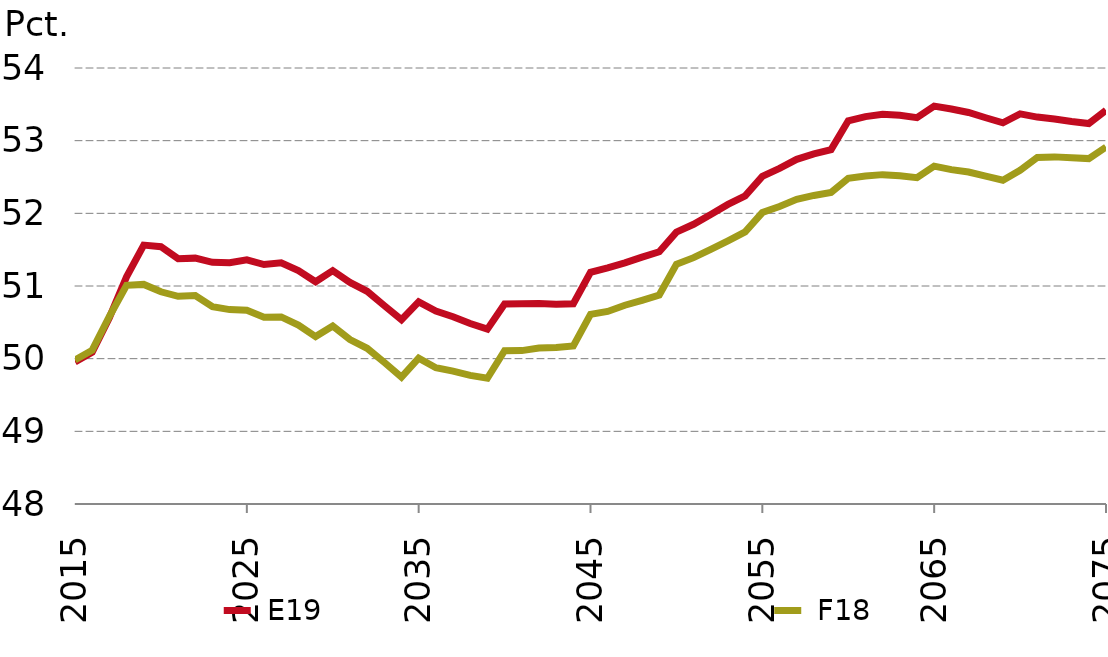
| Category | nullinje |  E19 |  F18 |
|---|---|---|---|
| 2015-01-01 | 0 | 49.954 | 49.982 |
| 2016-01-01 | 0 | 50.089 | 50.117 |
| 2017-01-01 | 0 | 50.564 | 50.581 |
| 2018-01-01 | 0 | 51.125 | 51.009 |
| 2019-01-01 | 0 | 51.563 | 51.022 |
| 2020-01-01 | 0 | 51.542 | 50.92 |
| 2021-01-01 | 0 | 51.376 | 50.858 |
| 2022-01-01 | 0 | 51.383 | 50.87 |
| 2023-01-01 | 0 | 51.325 | 50.716 |
| 2024-01-01 | 0 | 51.32 | 50.675 |
| 2025-01-01 | 0 | 51.361 | 50.666 |
| 2026-01-01 | 0 | 51.295 | 50.571 |
| 2027-01-01 | 0 | 51.319 | 50.575 |
| 2028-01-01 | 0 | 51.212 | 50.461 |
| 2029-01-01 | 0 | 51.058 | 50.304 |
| 2030-01-01 | 0 | 51.211 | 50.451 |
| 2031-01-01 | 0 | 51.05 | 50.264 |
| 2032-01-01 | 0 | 50.927 | 50.143 |
| 2033-01-01 | 0 | 50.73 | 49.949 |
| 2034-01-01 | 0 | 50.536 | 49.747 |
| 2035-01-01 | 0 | 50.782 | 50.006 |
| 2036-01-01 | 0 | 50.656 | 49.875 |
| 2037-01-01 | 0 | 50.578 | 49.83 |
| 2038-01-01 | 0 | 50.484 | 49.771 |
| 2039-01-01 | 0 | 50.406 | 49.73 |
| 2040-01-01 | 0 | 50.752 | 50.109 |
| 2041-01-01 | 0 | 50.756 | 50.111 |
| 2042-01-01 | 0 | 50.76 | 50.147 |
| 2043-01-01 | 0 | 50.749 | 50.153 |
| 2044-01-01 | 0 | 50.756 | 50.174 |
| 2045-01-01 | 0 | 51.189 | 50.61 |
| 2046-01-01 | 0 | 51.249 | 50.65 |
| 2047-01-01 | 0 | 51.317 | 50.735 |
| 2048-01-01 | 0 | 51.397 | 50.803 |
| 2049-01-01 | 0 | 51.471 | 50.877 |
| 2050-01-01 | 0 | 51.742 | 51.299 |
| 2051-01-01 | 0 | 51.849 | 51.39 |
| 2052-01-01 | 0 | 51.985 | 51.505 |
| 2053-01-01 | 0 | 52.123 | 51.621 |
| 2054-01-01 | 0 | 52.241 | 51.744 |
| 2055-01-01 | 0 | 52.509 | 52.01 |
| 2056-01-01 | 0 | 52.619 | 52.095 |
| 2057-01-01 | 0 | 52.743 | 52.192 |
| 2058-01-01 | 0 | 52.818 | 52.246 |
| 2059-01-01 | 0 | 52.877 | 52.289 |
| 2060-01-01 | 0 | 53.274 | 52.481 |
| 2061-01-01 | 0 | 53.331 | 52.513 |
| 2062-01-01 | 0 | 53.363 | 52.533 |
| 2063-01-01 | 0 | 53.35 | 52.516 |
| 2064-01-01 | 0 | 53.317 | 52.49 |
| 2065-01-01 | 0 | 53.476 | 52.649 |
| 2066-01-01 | 0 | 53.436 | 52.601 |
| 2067-01-01 | 0 | 53.388 | 52.568 |
| 2068-01-01 | 0 | 53.315 | 52.512 |
| 2069-01-01 | 0 | 53.245 | 52.455 |
| 2070-01-01 | 0 | 53.369 | 52.593 |
| 2071-01-01 | 0 | 53.325 | 52.768 |
| 2072-01-01 | 0 | 53.299 | 52.777 |
| 2073-01-01 | 0 | 53.264 | 52.763 |
| 2074-01-01 | 0 | 53.236 | 52.753 |
| 2075-01-01 | 0 | 53.419 | 52.912 |